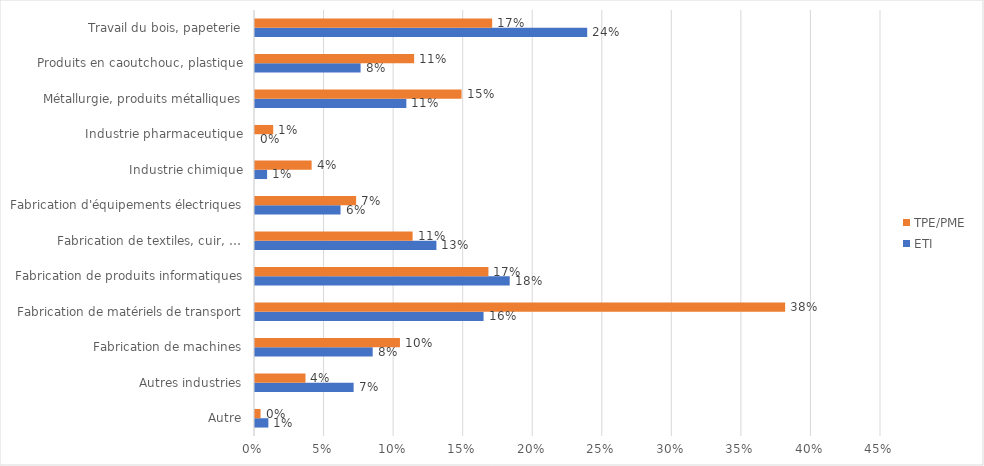
| Category | ETI | TPE/PME |
|---|---|---|
| Autre | 0.01 | 0.004 |
| Autres industries | 0.071 | 0.036 |
| Fabrication de machines | 0.085 | 0.104 |
| Fabrication de matériels de transport | 0.164 | 0.381 |
| Fabrication de produits informatiques | 0.183 | 0.168 |
| Fabrication de textiles, cuir, … | 0.13 | 0.113 |
| Fabrication d'équipements électriques | 0.062 | 0.073 |
| Industrie chimique | 0.009 | 0.041 |
| Industrie pharmaceutique | 0 | 0.013 |
| Métallurgie, produits métalliques | 0.109 | 0.148 |
| Produits en caoutchouc, plastique | 0.076 | 0.114 |
| Travail du bois, papeterie | 0.239 | 0.17 |